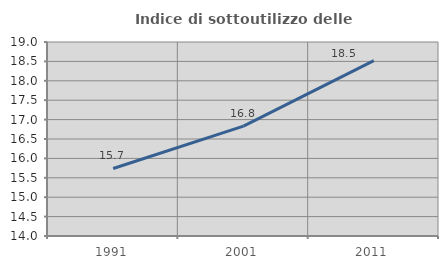
| Category | Indice di sottoutilizzo delle abitazioni  |
|---|---|
| 1991.0 | 15.74 |
| 2001.0 | 16.832 |
| 2011.0 | 18.521 |